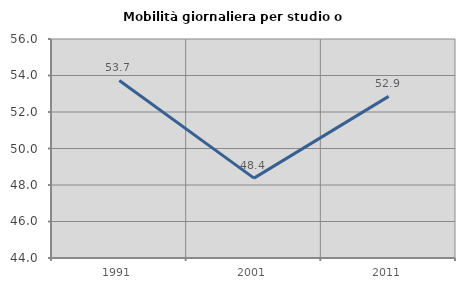
| Category | Mobilità giornaliera per studio o lavoro |
|---|---|
| 1991.0 | 53.728 |
| 2001.0 | 48.378 |
| 2011.0 | 52.857 |